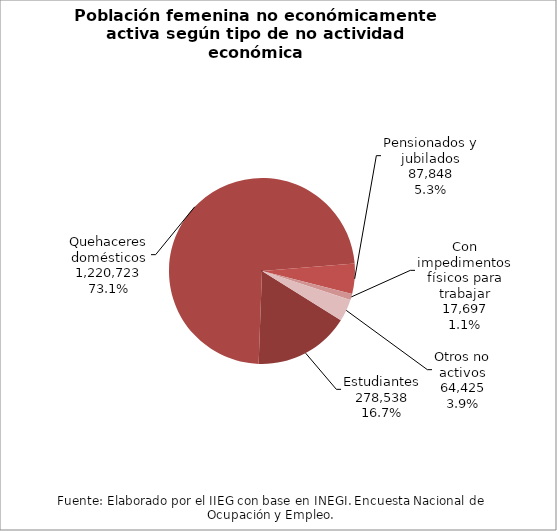
| Category | Series 0 |
|---|---|
| Estudiantes | 278538 |
| Quehaceres domésticos | 1220723 |
| Pensionados y jubilados | 87848 |
| Con impedimentos físicos para trabajar | 17697 |
| Otros no activos | 64425 |